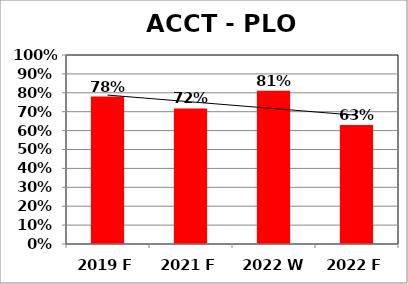
| Category | Series 0 |
|---|---|
| 2019 F | 0.78 |
| 2021 F | 0.717 |
| 2022 W | 0.811 |
| 2022 F | 0.63 |